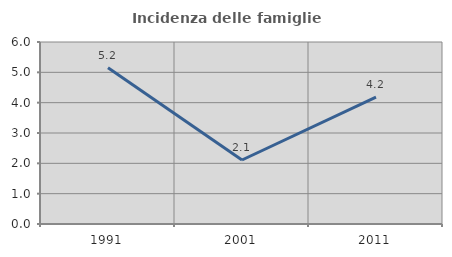
| Category | Incidenza delle famiglie numerose |
|---|---|
| 1991.0 | 5.155 |
| 2001.0 | 2.11 |
| 2011.0 | 4.183 |